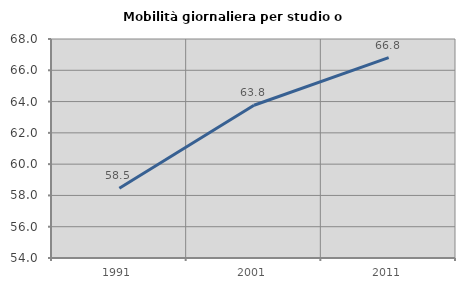
| Category | Mobilità giornaliera per studio o lavoro |
|---|---|
| 1991.0 | 58.457 |
| 2001.0 | 63.764 |
| 2011.0 | 66.811 |